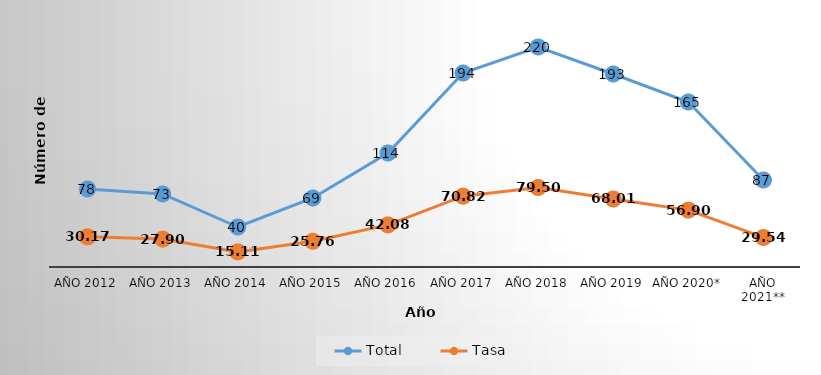
| Category | Total | Tasa |
|---|---|---|
| Año 2012 | 78 | 30.172 |
| Año 2013 | 73 | 27.899 |
| Año 2014 | 40 | 15.107 |
| Año 2015 | 69 | 25.761 |
| Año 2016 | 114 | 42.081 |
| Año 2017 | 194 | 70.822 |
| Año 2018 | 220 | 79.496 |
| Año 2019 | 193 | 68.007 |
| Año 2020* | 165 | 56.898 |
| Año 2021** | 87 | 29.536 |